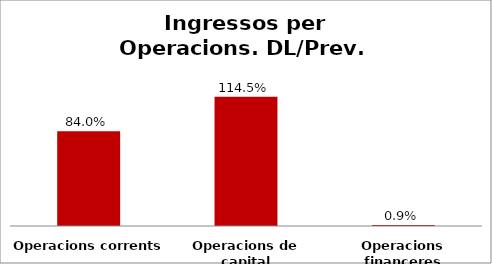
| Category | Series 0 |
|---|---|
| Operacions corrents | 0.84 |
| Operacions de capital | 1.145 |
| Operacions financeres | 0.009 |